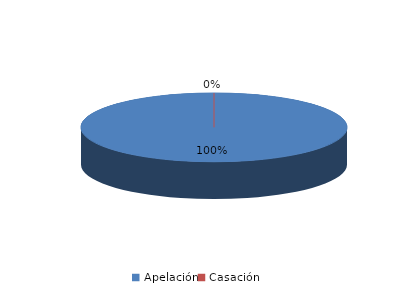
| Category | Series 0 |
|---|---|
| Apelación | 3 |
| Casación | 0 |